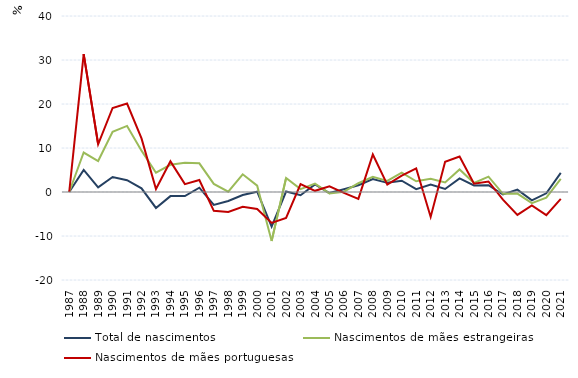
| Category | Total de nascimentos | Nascimentos de mães estrangeiras | Nascimentos de mães portuguesas |
|---|---|---|---|
| 1987.0 | 0 | 0 | 0 |
| 1988.0 | 5.019 | 8.972 | 31.317 |
| 1989.0 | 1.039 | 7.035 | 10.845 |
| 1990.0 | 3.399 | 13.664 | 19.095 |
| 1991.0 | 2.694 | 15.025 | 20.097 |
| 1992.0 | 0.824 | 9.394 | 12.174 |
| 1993.0 | -3.622 | 4.378 | 0.689 |
| 1994.0 | -0.934 | 6.181 | 6.968 |
| 1995.0 | -0.936 | 6.632 | 1.796 |
| 1996.0 | 0.978 | 6.522 | 2.721 |
| 1997.0 | -2.919 | 1.846 | -4.279 |
| 1998.0 | -2.029 | 0.064 | -4.532 |
| 1999.0 | -0.685 | 4.023 | -3.345 |
| 2000.0 | 0.064 | 1.448 | -3.856 |
| 2001.0 | -7.855 | -11.129 | -7.028 |
| 2002.0 | 0.107 | 3.201 | -5.9 |
| 2003.0 | -0.724 | 0.646 | 1.803 |
| 2004.0 | 1.718 | 1.891 | 0.269 |
| 2005.0 | -0.245 | -0.323 | 1.305 |
| 2006.0 | 0.642 | 0.072 | -0.189 |
| 2007.0 | 1.531 | 1.994 | -1.557 |
| 2008.0 | 2.949 | 3.473 | 8.523 |
| 2009.0 | 2.08 | 2.527 | 1.67 |
| 2010.0 | 2.56 | 4.42 | 3.705 |
| 2011.0 | 0.645 | 2.445 | 5.359 |
| 2012.0 | 1.678 | 2.994 | -5.662 |
| 2013.0 | 0.69 | 2.173 | 6.884 |
| 2014.0 | 3.09 | 5.126 | 8.058 |
| 2015.0 | 1.491 | 2.047 | 1.879 |
| 2016.0 | 1.53 | 3.476 | 2.392 |
| 2017.0 | -0.571 | -0.405 | -1.745 |
| 2018.0 | 0.538 | -0.353 | -5.213 |
| 2019.0 | -1.911 | -2.52 | -3.052 |
| 2020.0 | -0.299 | -1.297 | -5.268 |
| 2021.0 | 4.342 | 2.959 | -1.547 |